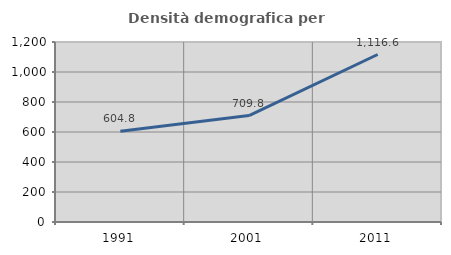
| Category | Densità demografica |
|---|---|
| 1991.0 | 604.807 |
| 2001.0 | 709.84 |
| 2011.0 | 1116.567 |